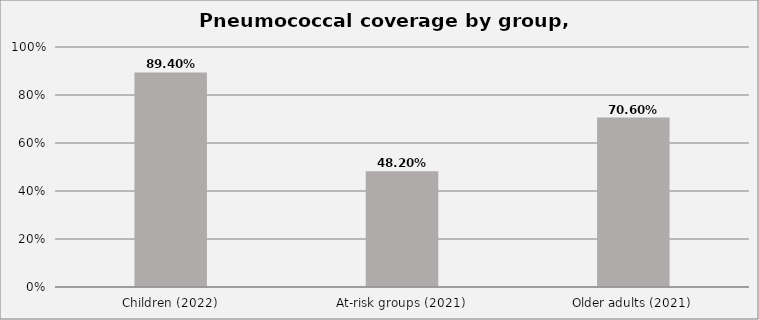
| Category | Series 0 |
|---|---|
| Children (2022) | 0.894 |
| At-risk groups (2021) | 0.482 |
| Older adults (2021) | 0.706 |